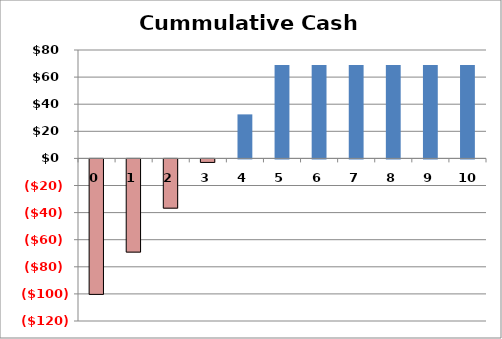
| Category | Series 1 |
|---|---|
| 0.0 | -100 |
| 1.0 | -68.8 |
| 2.0 | -36.352 |
| 3.0 | -2.606 |
| 4.0 | 32.49 |
| 5.0 | 68.989 |
| 6.0 | 68.989 |
| 7.0 | 68.989 |
| 8.0 | 68.989 |
| 9.0 | 68.989 |
| 10.0 | 68.989 |